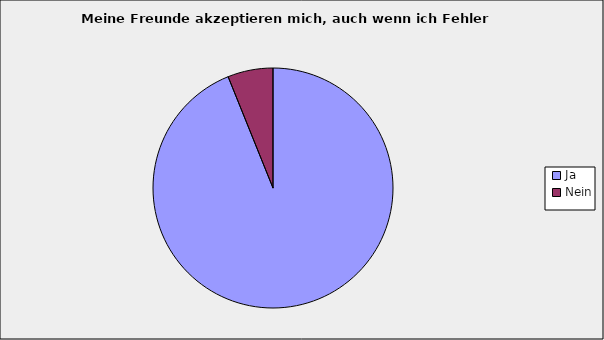
| Category | Series 0 |
|---|---|
| Ja | 0.939 |
| Nein | 0.061 |